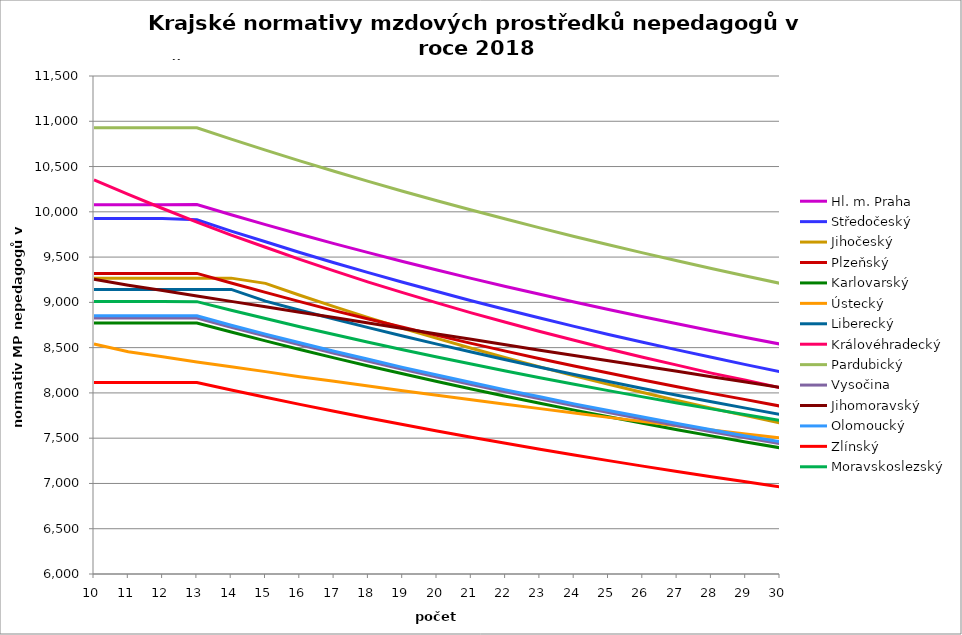
| Category | Hl. m. Praha | Středočeský | Jihočeský | Plzeňský | Karlovarský  | Ústecký   | Liberecký | Královéhradecký | Pardubický | Vysočina | Jihomoravský | Olomoucký | Zlínský | Moravskoslezský |
|---|---|---|---|---|---|---|---|---|---|---|---|---|---|---|
| 10.0 | 10077.971 | 9924.868 | 9267.509 | 9319.805 | 8772.707 | 8539.437 | 9142.389 | 10353.778 | 10927.718 | 8826.407 | 9255.688 | 8851.852 | 8115.046 | 9009.103 |
| 11.0 | 10077.971 | 9924.868 | 9267.509 | 9319.805 | 8772.707 | 8453.856 | 9142.389 | 10192.708 | 10927.718 | 8826.407 | 9189.381 | 8851.852 | 8115.046 | 9009.103 |
| 12.0 | 10077.971 | 9924.868 | 9267.509 | 9319.805 | 8772.707 | 8398.961 | 9142.389 | 10036.573 | 10927.718 | 8826.407 | 9131.658 | 8851.852 | 8115.046 | 9009.103 |
| 13.0 | 10079.675 | 9911.757 | 9267.509 | 9319.805 | 8772.785 | 8341.187 | 9142.47 | 9885.149 | 10927.815 | 8826.407 | 9070.882 | 8851.852 | 8115.046 | 9007.748 |
| 14.0 | 9967.203 | 9786.783 | 9267.509 | 9213.666 | 8672.115 | 8287.74 | 9142.574 | 9742.751 | 10802.416 | 8725.123 | 9010.909 | 8747.712 | 8032.29 | 8913.102 |
| 15.0 | 9858.029 | 9669.072 | 9210.044 | 9109.918 | 8574.398 | 8234.975 | 9013.791 | 9608.799 | 10680.694 | 8626.884 | 8951.724 | 8649.72 | 7951.757 | 8821.077 |
| 16.0 | 9752.018 | 9550.106 | 9078.972 | 9008.48 | 8479.512 | 8179.427 | 8913.181 | 9474.198 | 10562.5 | 8531.563 | 8889.686 | 8553.899 | 7873.363 | 8731.57 |
| 17.0 | 9649.044 | 9437.987 | 8952.877 | 8909.276 | 8387.343 | 8128.027 | 8815.47 | 9347.481 | 10447.689 | 8438.683 | 8832.078 | 8460.177 | 7797.03 | 8644.487 |
| 18.0 | 9548.987 | 9328.471 | 8831.502 | 8815.926 | 8297.781 | 8077.269 | 8720.542 | 9224.109 | 10336.127 | 8348.504 | 8771.681 | 8371.977 | 7722.683 | 8559.737 |
| 19.0 | 9451.733 | 9221.467 | 8714.604 | 8724.513 | 8210.725 | 8023.821 | 8628.285 | 9107.906 | 10227.686 | 8260.916 | 8712.105 | 8282.178 | 7650.251 | 8477.234 |
| 20.0 | 9357.174 | 9120.583 | 8601.96 | 8634.975 | 8126.077 | 7974.353 | 8538.596 | 8994.595 | 10122.244 | 8175.819 | 8649.901 | 8197.632 | 7579.666 | 8396.897 |
| 21.0 | 9265.209 | 9018.269 | 8493.359 | 8547.257 | 8043.745 | 7925.49 | 8451.376 | 8884.068 | 10019.687 | 8093.114 | 8591.962 | 8114.794 | 7510.864 | 8318.648 |
| 22.0 | 9175.74 | 8921.76 | 8388.608 | 8461.303 | 7963.641 | 7874.026 | 8366.529 | 8779.899 | 9919.905 | 8012.388 | 8531.455 | 8033.613 | 7443.783 | 8242.412 |
| 23.0 | 9088.676 | 8827.294 | 8287.522 | 8377.061 | 7885.682 | 7826.382 | 8283.968 | 8678.146 | 9822.795 | 7933.888 | 8471.795 | 7957.194 | 7378.364 | 8168.119 |
| 24.0 | 9003.928 | 8734.808 | 8189.931 | 8297.751 | 7809.788 | 7779.31 | 8203.608 | 8582.235 | 9728.259 | 7857.532 | 8412.963 | 7879.121 | 7314.552 | 8095.703 |
| 25.0 | 8921.414 | 8644.24 | 8095.673 | 8219.93 | 7735.886 | 7729.721 | 8125.368 | 8484.986 | 9636.202 | 7783.239 | 8354.943 | 7805.599 | 7252.293 | 8025.098 |
| 26.0 | 8841.054 | 8558.783 | 8004.599 | 8143.554 | 7663.903 | 7683.802 | 8049.171 | 8393.275 | 9546.537 | 7710.935 | 8297.717 | 7733.436 | 7191.536 | 7956.244 |
| 27.0 | 8762.773 | 8475 | 7916.567 | 8068.585 | 7593.772 | 7638.425 | 7974.944 | 8306.815 | 9459.178 | 7640.255 | 8238.156 | 7662.595 | 7132.232 | 7889.082 |
| 28.0 | 8686.499 | 8392.841 | 7831.445 | 7994.983 | 7525.427 | 7590.61 | 7902.619 | 8218.895 | 9374.044 | 7571.434 | 8179.445 | 7593.041 | 7074.335 | 7823.557 |
| 29.0 | 8612.164 | 8312.26 | 7749.107 | 7925.697 | 7458.807 | 7546.324 | 7832.129 | 8139.13 | 9291.059 | 7504.407 | 8121.564 | 7524.738 | 7017.799 | 7759.616 |
| 30.0 | 8539.701 | 8233.211 | 7669.435 | 7854.668 | 7393.853 | 7502.552 | 7763.411 | 8057.802 | 9210.15 | 7439.113 | 8061.516 | 7460.424 | 6962.583 | 7697.208 |